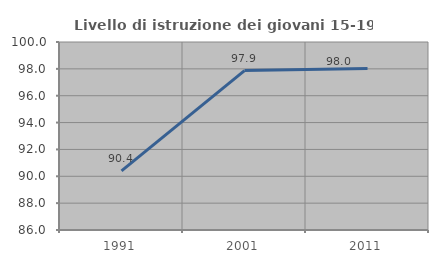
| Category | Livello di istruzione dei giovani 15-19 anni |
|---|---|
| 1991.0 | 90.407 |
| 2001.0 | 97.874 |
| 2011.0 | 98.029 |